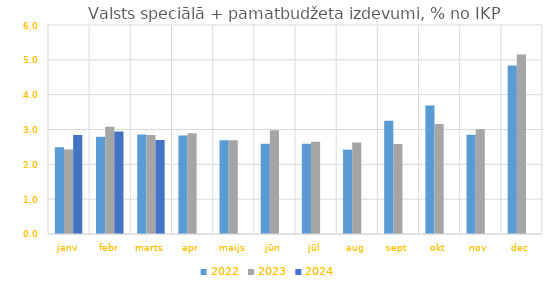
| Category | 2022 | 2023 | 2024 |
|---|---|---|---|
| janv | 2.487 | 2.428 | 2.842 |
| febr | 2.789 | 3.078 | 2.939 |
| marts | 2.856 | 2.845 | 2.697 |
| apr | 2.827 | 2.889 | 0 |
| maijs | 2.689 | 2.693 | 0 |
| jūn | 2.59 | 2.975 | 0 |
| jūl | 2.592 | 2.65 | 0 |
| aug | 2.422 | 2.625 | 0 |
| sept | 3.25 | 2.583 | 0 |
| okt | 3.688 | 3.159 | 0 |
| nov | 2.847 | 3.01 | 0 |
| dec | 4.838 | 5.152 | 0 |